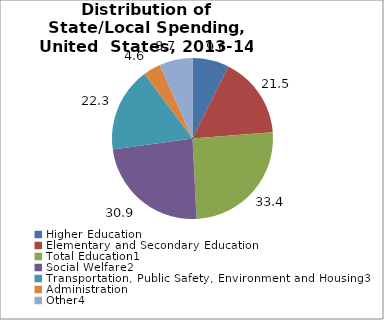
| Category | Series 0 |
|---|---|
| Higher Education | 9.639 |
| Elementary and Secondary Education | 21.496 |
| Total Education1 | 33.377 |
| Social Welfare2 | 30.948 |
| Transportation, Public Safety, Environment and Housing3 | 22.324 |
| Administration | 4.601 |
| Other4 | 8.75 |